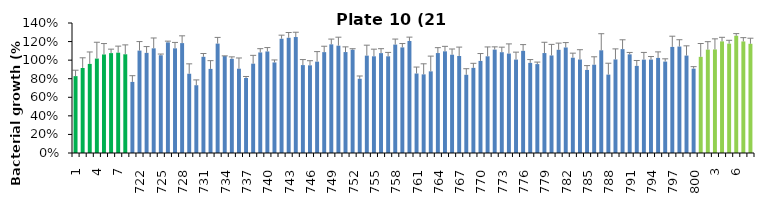
| Category | 21 h % |
|---|---|
| 1.0 | 0.828 |
| 2.0 | 0.916 |
| 3.0 | 0.959 |
| 4.0 | 1.017 |
| 5.0 | 1.061 |
| 6.0 | 1.076 |
| 7.0 | 1.08 |
| 8.0 | 1.063 |
| 721.0 | 0.766 |
| 722.0 | 1.103 |
| 723.0 | 1.078 |
| 724.0 | 1.127 |
| 725.0 | 1.053 |
| 726.0 | 1.191 |
| 727.0 | 1.127 |
| 728.0 | 1.183 |
| 729.0 | 0.854 |
| 730.0 | 0.73 |
| 731.0 | 1.036 |
| 732.0 | 0.906 |
| 733.0 | 1.178 |
| 734.0 | 1.044 |
| 735.0 | 1.014 |
| 736.0 | 0.908 |
| 737.0 | 0.808 |
| 738.0 | 0.962 |
| 739.0 | 1.083 |
| 740.0 | 1.094 |
| 741.0 | 0.975 |
| 742.0 | 1.23 |
| 743.0 | 1.241 |
| 744.0 | 1.249 |
| 745.0 | 0.947 |
| 746.0 | 0.944 |
| 747.0 | 0.984 |
| 748.0 | 1.086 |
| 749.0 | 1.17 |
| 750.0 | 1.156 |
| 751.0 | 1.087 |
| 752.0 | 1.113 |
| 753.0 | 0.799 |
| 754.0 | 1.049 |
| 755.0 | 1.041 |
| 756.0 | 1.076 |
| 757.0 | 1.041 |
| 758.0 | 1.168 |
| 759.0 | 1.137 |
| 760.0 | 1.207 |
| 761.0 | 0.856 |
| 762.0 | 0.847 |
| 763.0 | 0.879 |
| 764.0 | 1.076 |
| 765.0 | 1.095 |
| 766.0 | 1.059 |
| 767.0 | 1.045 |
| 768.0 | 0.842 |
| 769.0 | 0.917 |
| 770.0 | 0.992 |
| 771.0 | 1.041 |
| 772.0 | 1.113 |
| 773.0 | 1.086 |
| 774.0 | 1.071 |
| 775.0 | 1.006 |
| 776.0 | 1.1 |
| 777.0 | 0.971 |
| 778.0 | 0.957 |
| 779.0 | 1.076 |
| 780.0 | 1.051 |
| 781.0 | 1.111 |
| 782.0 | 1.137 |
| 783.0 | 1.026 |
| 784.0 | 1.007 |
| 785.0 | 0.895 |
| 786.0 | 0.951 |
| 787.0 | 1.106 |
| 788.0 | 0.844 |
| 789.0 | 1.008 |
| 790.0 | 1.119 |
| 791.0 | 1.062 |
| 792.0 | 0.938 |
| 793.0 | 1.006 |
| 794.0 | 1.006 |
| 795.0 | 1.024 |
| 796.0 | 0.984 |
| 797.0 | 1.142 |
| 798.0 | 1.146 |
| 799.0 | 1.049 |
| 800.0 | 0.908 |
| 1.0 | 1.035 |
| 2.0 | 1.113 |
| 3.0 | 1.115 |
| 4.0 | 1.202 |
| 5.0 | 1.178 |
| 6.0 | 1.263 |
| 7.0 | 1.201 |
| 8.0 | 1.176 |